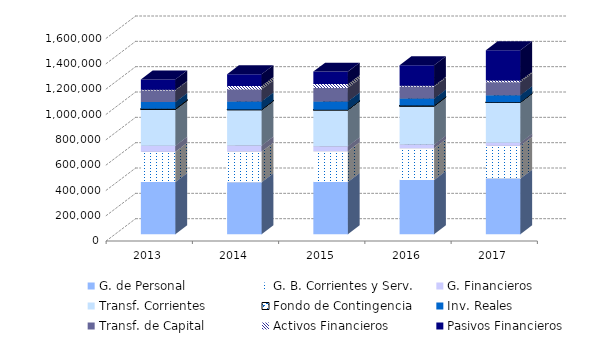
| Category | G. de Personal | G. B. Corrientes y Serv. | G. Financieros | Transf. Corrientes | Fondo de Contingencia | Inv. Reales | Transf. de Capital | Activos Financieros | Pasivos Financieros |
|---|---|---|---|---|---|---|---|---|---|
| 2013.0 | 413641 | 238445 | 47034 | 287000 | 5000 | 53257 | 91736 | 4674 | 81594 |
| 2014.0 | 410758.44 | 242485.53 | 47516.2 | 282589.71 | 2000 | 63671.77 | 94344.31 | 28226.74 | 92107.3 |
| 2015.0 | 412548 | 243565.45 | 39447.34 | 287298.55 | 1000 | 64397.32 | 107562.88 | 29829.1 | 98601.35 |
| 2016.0 | 429004.83 | 250410.6 | 28616.42 | 304708.96 | 3132.77 | 55579.04 | 94165.44 | 7912.49 | 160659.45 |
| 2017.0 | 440058.89 | 259317.69 | 24101.25 | 318902.58 | 1 | 55701.46 | 102564.13 | 12791.54 | 239136.46 |